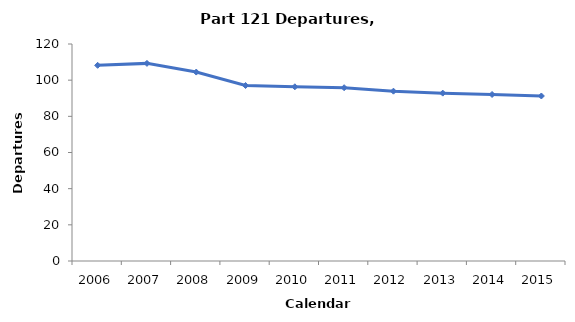
| Category | Departures (100,000s) |
|---|---|
| 2006.0 | 108.209 |
| 2007.0 | 109.284 |
| 2008.0 | 104.481 |
| 2009.0 | 97.051 |
| 2010.0 | 96.338 |
| 2011.0 | 95.839 |
| 2012.0 | 93.907 |
| 2013.0 | 92.832 |
| 2014.0 | 92.084 |
| 2015.0 | 91.246 |